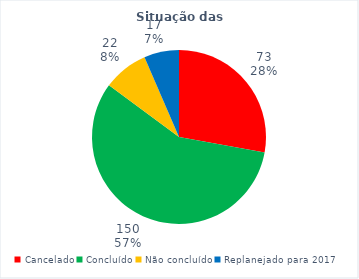
| Category | INICIATIVAS |
|---|---|
| Cancelado | 73 |
| Concluído | 150 |
| Não concluído | 22 |
| Replanejado para 2017 | 17 |